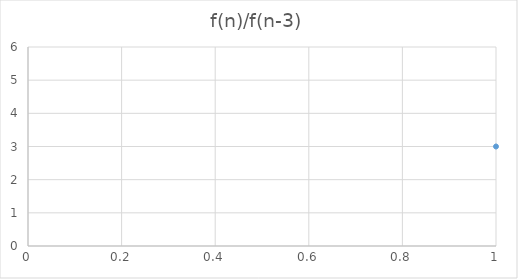
| Category | Series 0 |
|---|---|
| 0 | 3 |
| 1 | 5 |
| 2 | 4 |
| 3 | 4.333 |
| 4 | 4.2 |
| 5 | 4.25 |
| 6 | 4.231 |
| 7 | 4.238 |
| 8 | 4.235 |
| 9 | 4.236 |
| 10 | 4.236 |
| 11 | 4.236 |
| 12 | 4.236 |
| 13 | 4.236 |
| 14 | 4.236 |
| 15 | 4.236 |
| 16 | 4.236 |
| 17 | 4.236 |
| 18 | 4.236 |
| 19 | 4.236 |
| 20 | 4.236 |
| 21 | 4.236 |
| 22 | 4.236 |
| 23 | 4.236 |
| 24 | 4.236 |
| 25 | 4.236 |
| 26 | 4.236 |
| 27 | 4.236 |
| 28 | 4.236 |
| 29 | 4.236 |
| 30 | 4.236 |
| 31 | 4.236 |
| 32 | 4.236 |
| 33 | 4.236 |
| 34 | 4.236 |
| 35 | 4.236 |
| 36 | 4.236 |
| 37 | 4.236 |
| 38 | 4.236 |
| 39 | 4.236 |
| 40 | 4.236 |
| 41 | 4.236 |
| 42 | 4.236 |
| 43 | 4.236 |
| 44 | 4.236 |
| 45 | 4.236 |
| 46 | 4.236 |
| 47 | 4.236 |
| 48 | 4.236 |
| 49 | 4.236 |
| 50 | 4.236 |
| 51 | 4.236 |
| 52 | 4.236 |
| 53 | 4.236 |
| 54 | 4.236 |
| 55 | 4.236 |
| 56 | 4.236 |
| 57 | 4.236 |
| 58 | 4.236 |
| 59 | 4.236 |
| 60 | 4.236 |
| 61 | 4.236 |
| 62 | 4.236 |
| 63 | 4.236 |
| 64 | 4.236 |
| 65 | 4.236 |
| 66 | 4.236 |
| 67 | 4.236 |
| 68 | 4.236 |
| 69 | 4.236 |
| 70 | 4.236 |
| 71 | 4.236 |
| 72 | 4.236 |
| 73 | 4.236 |
| 74 | 4.236 |
| 75 | 4.236 |
| 76 | 4.236 |
| 77 | 4.236 |
| 78 | 4.236 |
| 79 | 4.236 |
| 80 | 4.236 |
| 81 | 4.236 |
| 82 | 4.236 |
| 83 | 4.236 |
| 84 | 4.236 |
| 85 | 4.236 |
| 86 | 4.236 |
| 87 | 4.236 |
| 88 | 4.236 |
| 89 | 4.236 |
| 90 | 4.236 |
| 91 | 4.236 |
| 92 | 4.236 |
| 93 | 4.236 |
| 94 | 4.236 |
| 95 | 4.236 |
| 96 | 4.236 |